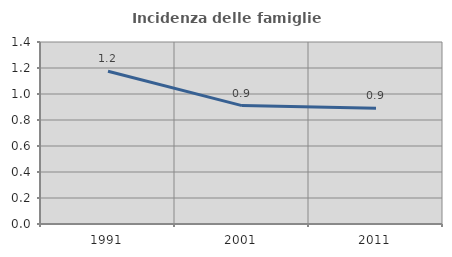
| Category | Incidenza delle famiglie numerose |
|---|---|
| 1991.0 | 1.175 |
| 2001.0 | 0.911 |
| 2011.0 | 0.89 |